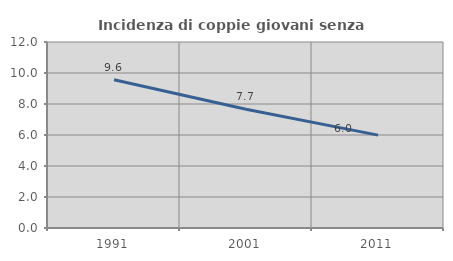
| Category | Incidenza di coppie giovani senza figli |
|---|---|
| 1991.0 | 9.565 |
| 2001.0 | 7.657 |
| 2011.0 | 5.992 |